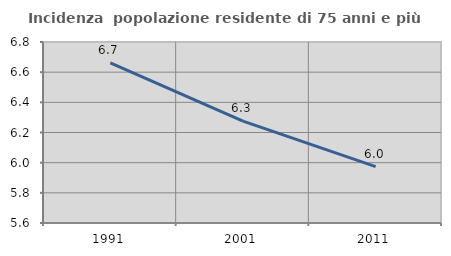
| Category | Incidenza  popolazione residente di 75 anni e più |
|---|---|
| 1991.0 | 6.662 |
| 2001.0 | 6.275 |
| 2011.0 | 5.974 |